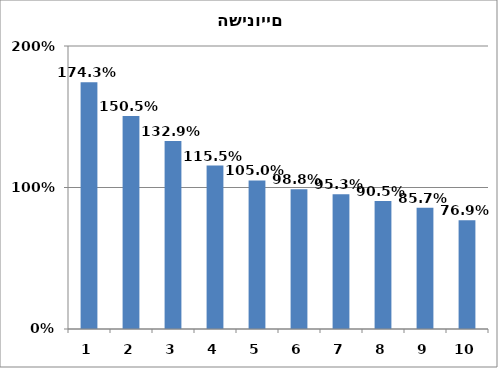
| Category | Series 0 |
|---|---|
| 0 | 1.743 |
| 1 | 1.505 |
| 2 | 1.329 |
| 3 | 1.155 |
| 4 | 1.05 |
| 5 | 0.988 |
| 6 | 0.953 |
| 7 | 0.905 |
| 8 | 0.857 |
| 9 | 0.769 |